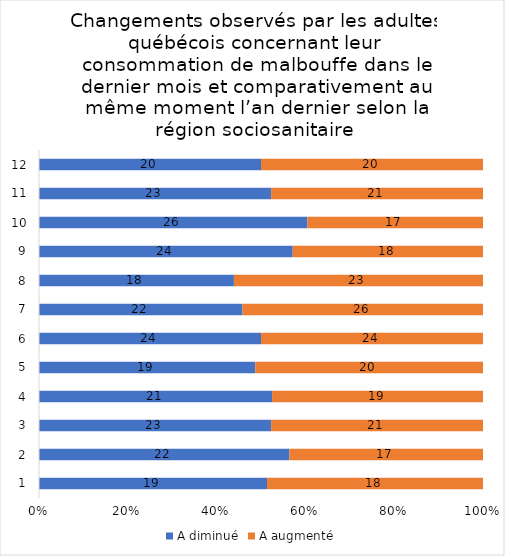
| Category | A diminué | A augmenté |
|---|---|---|
| 0 | 19 | 18 |
| 1 | 22 | 17 |
| 2 | 23 | 21 |
| 3 | 21 | 19 |
| 4 | 19 | 20 |
| 5 | 24 | 24 |
| 6 | 22 | 26 |
| 7 | 18 | 23 |
| 8 | 24 | 18 |
| 9 | 26 | 17 |
| 10 | 23 | 21 |
| 11 | 20 | 20 |